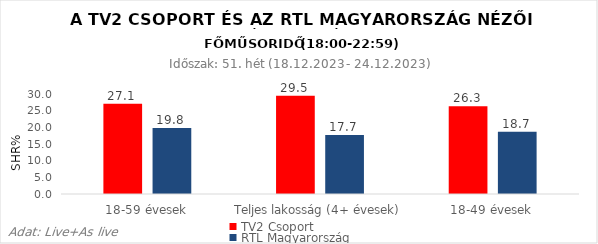
| Category | TV2 Csoport | RTL Magyarország |
|---|---|---|
| 18-59 évesek | 27.1 | 19.8 |
| Teljes lakosság (4+ évesek) | 29.5 | 17.7 |
| 18-49 évesek | 26.3 | 18.7 |